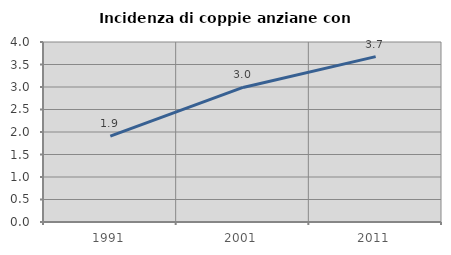
| Category | Incidenza di coppie anziane con figli |
|---|---|
| 1991.0 | 1.907 |
| 2001.0 | 2.99 |
| 2011.0 | 3.675 |